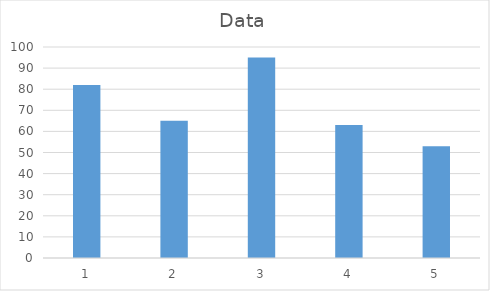
| Category | Data |
|---|---|
| 0 | 82 |
| 1 | 65 |
| 2 | 95 |
| 3 | 63 |
| 4 | 53 |